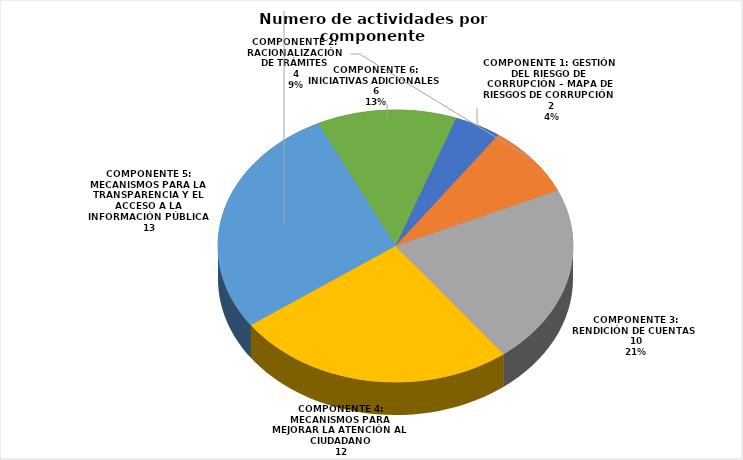
| Category | Cantidad de Actividades |
|---|---|
| COMPONENTE 1: GESTIÓN DEL RIESGO DE CORRUPCIÓN – MAPA DE RIESGOS DE CORRUPCIÓN | 2 |
| COMPONENTE 2: RACIONALIZACIÓN DE TRÁMITES | 4 |
| COMPONENTE 3: RENDICIÓN DE CUENTAS | 10 |
| COMPONENTE 4: MECANISMOS PARA MEJORAR LA ATENCIÓN AL CIUDADANO | 12 |
| COMPONENTE 5: MECANISMOS PARA LA TRANSPARENCIA Y EL ACCESO A LA INFORMACIÓN PÚBLICA | 13 |
| COMPONENTE 6: INICIATIVAS ADICIONALES | 6 |